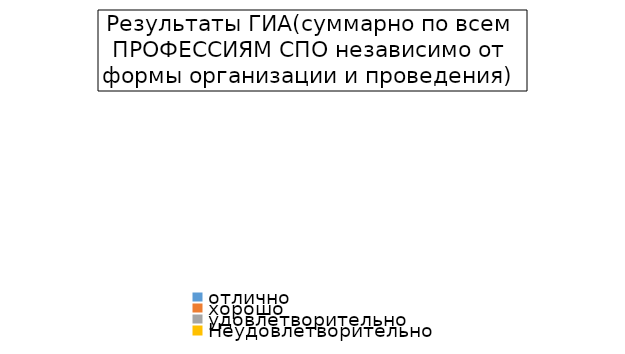
| Category | Series 1 |
|---|---|
| отлично | 0 |
| хорошо | 0 |
| удовлетворительно  | 0 |
| Неудовлетворительно  | 0 |